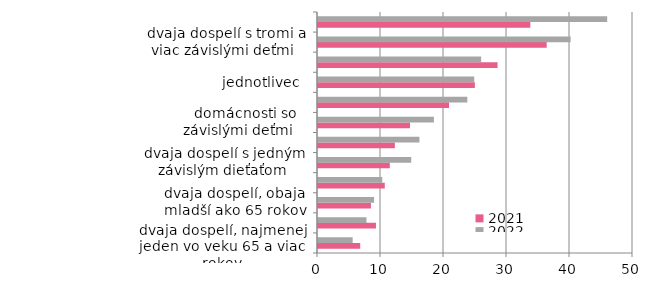
| Category | 2021 | 2022 |
|---|---|---|
| dvaja dospelí, najmenej jeden vo veku 65 a viac rokov | 6.7 | 5.5 |
| domácnosti  bez závislých detí     | 9.2 | 7.7 |
| dvaja dospelí, obaja mladší ako 65 rokov | 8.4 | 8.9 |
| dvaja dospelí s dvomi závislými dieťmi   | 10.6 | 10.2 |
| dvaja dospelí s jedným závislým dieťaťom  | 11.4 | 14.8 |
| traja a viac dospelí so závislými deťmi    | 12.2 | 16.1 |
| domácnosti so závislými deťmi    | 14.6 | 18.4 |
| jednotlivec mladší ako 65 rokov | 20.8 | 23.7 |
| jednotlivec  | 24.9 | 24.8 |
| jednotlivec vo veku 65 a viac rokov | 28.5 | 25.9 |
| dvaja dospelí s tromi a viac závislými deťmi   | 36.3 | 40.1 |
| jednotlivec s najmenej jedným dieťaťom | 33.7 | 45.9 |